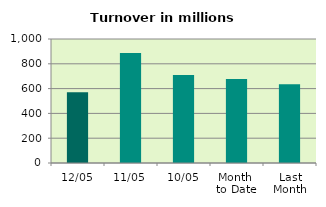
| Category | Series 0 |
|---|---|
| 12/05 | 570.051 |
| 11/05 | 887.048 |
| 10/05 | 709.113 |
| Month 
to Date | 678.225 |
| Last
Month | 634.312 |